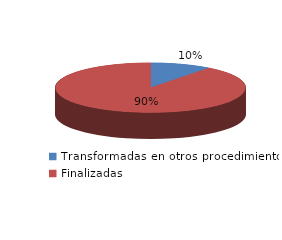
| Category | Series 0 |
|---|---|
| Transformadas en otros procedimientos | 4131 |
| Finalizadas | 35783 |